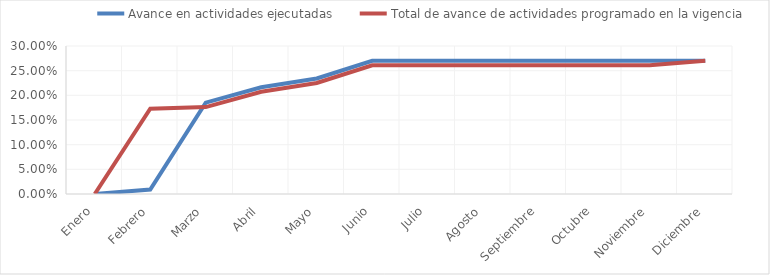
| Category | Avance en actividades ejecutadas | Total de avance de actividades programado en la vigencia |
|---|---|---|
| 0 | 0 | 0 |
| 1 | 0.009 | 0.173 |
| 2 | 0.185 | 0.176 |
| 3 | 0.216 | 0.207 |
| 4 | 0.234 | 0.225 |
| 5 | 0.27 | 0.261 |
| 6 | 0.27 | 0.261 |
| 7 | 0.27 | 0.261 |
| 8 | 0.27 | 0.261 |
| 9 | 0.27 | 0.261 |
| 10 | 0.27 | 0.261 |
| 11 | 0.27 | 0.27 |